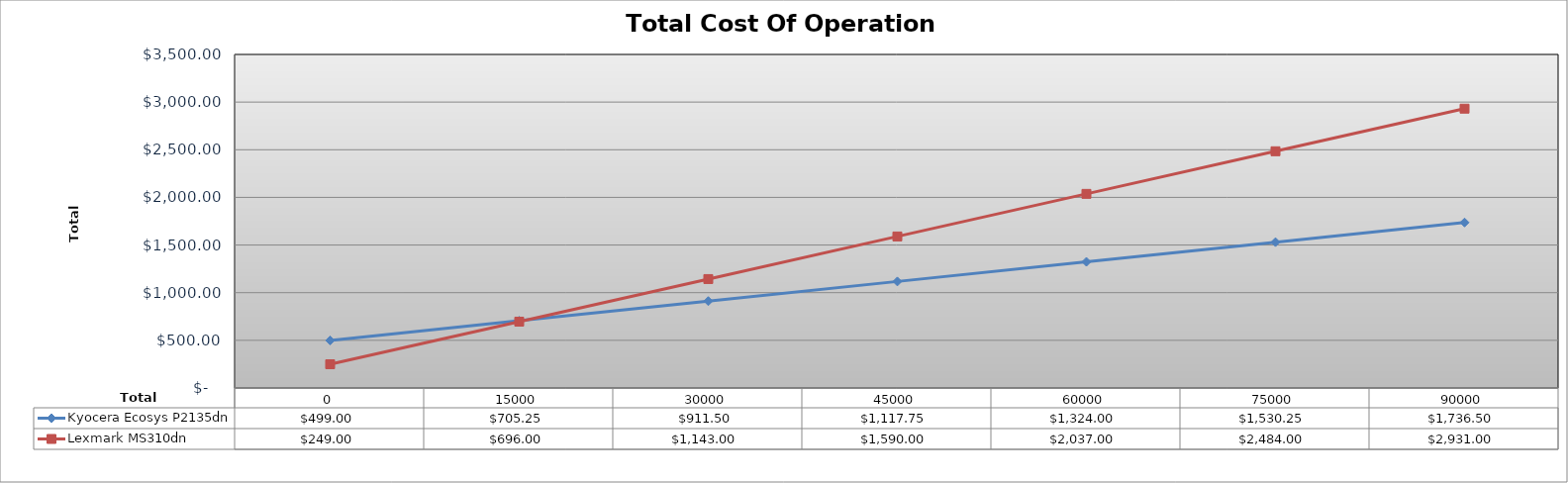
| Category | Kyocera Ecosys P2135dn | Lexmark MS310dn |
|---|---|---|
| 0 | 499 | 249 |
| 1 | 705.25 | 696 |
| 2 | 911.5 | 1143 |
| 3 | 1117.75 | 1590 |
| 4 | 1324 | 2037 |
| 5 | 1530.25 | 2484 |
| 6 | 1736.5 | 2931 |